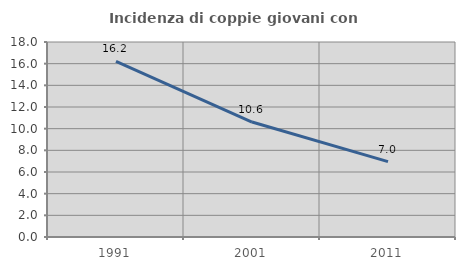
| Category | Incidenza di coppie giovani con figli |
|---|---|
| 1991.0 | 16.222 |
| 2001.0 | 10.61 |
| 2011.0 | 6.961 |